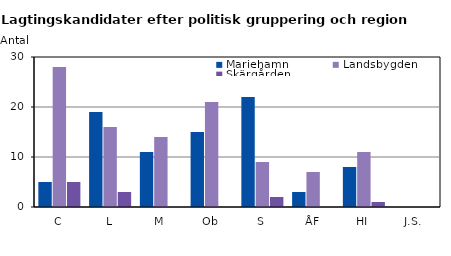
| Category | Mariehamn | Landsbygden | Skärgården |
|---|---|---|---|
| C | 5 | 28 | 5 |
| L | 19 | 16 | 3 |
| M | 11 | 14 | 0 |
| Ob | 15 | 21 | 0 |
| S | 22 | 9 | 2 |
| ÅF | 3 | 7 | 0 |
| HI | 8 | 11 | 1 |
| J.S. | 0 | 0 | 0 |